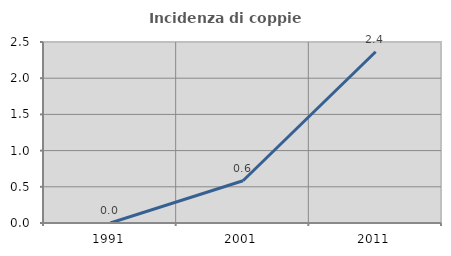
| Category | Incidenza di coppie miste |
|---|---|
| 1991.0 | 0 |
| 2001.0 | 0.584 |
| 2011.0 | 2.366 |